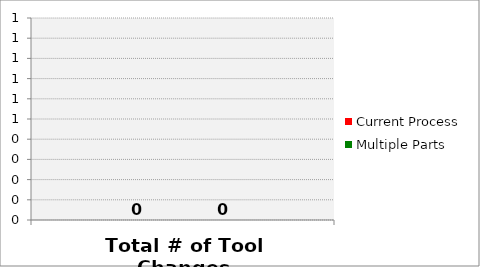
| Category | Current Process | Multiple Parts |
|---|---|---|
| Total # of Tool Changes | 0 | 0 |